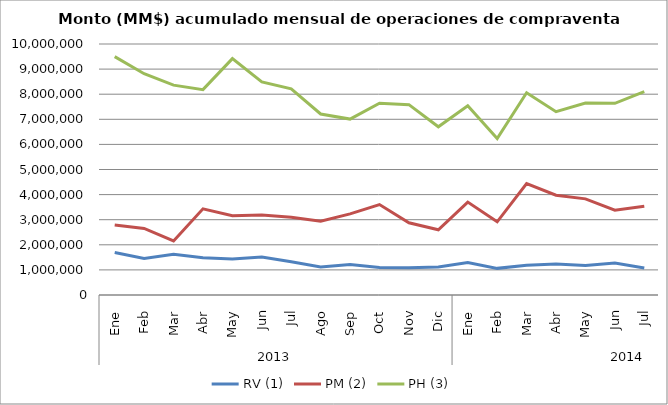
| Category | RV (1) | PM (2) | PH (3) |
|---|---|---|---|
| 0 | 1693090.019 | 2788692.01 | 9495719.157 |
| 1 | 1457870.523 | 2652319.476 | 8814454.346 |
| 2 | 1619570.46 | 2155113.626 | 8361658.957 |
| 3 | 1485677.791 | 3434435.881 | 8182321.991 |
| 4 | 1434943.507 | 3155786.06 | 9417818.094 |
| 5 | 1516566.545 | 3191285.457 | 8490151.421 |
| 6 | 1322115.523 | 3099755.507 | 8212010.547 |
| 7 | 1118245.895 | 2937089.197 | 7211658.784 |
| 8 | 1215047.725 | 3232334.418 | 7008526.172 |
| 9 | 1092035.083 | 3603082.09 | 7640993.748 |
| 10 | 1088055.605 | 2879188.198 | 7583918.365 |
| 11 | 1114851.326 | 2596986.123 | 6700659.979 |
| 12 | 1296256.43 | 3700290.091 | 7538361.261 |
| 13 | 1061199.219 | 2915830.381 | 6230064.605 |
| 14 | 1189463.212 | 4440910.02 | 8058380.739 |
| 15 | 1231035.305 | 3977428.452 | 7305106.144 |
| 16 | 1178985.046 | 3830415.456 | 7649023.753 |
| 17 | 1271543.287 | 3377453.657 | 7635505.378 |
| 18 | 1074038.901 | 3538491.307 | 8103978.154 |